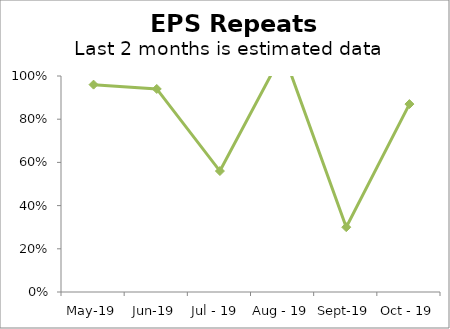
| Category | LONG FURLONG MEDICAL CENTRE |
|---|---|
| May-19 | 0.96 |
| Jun-19 | 0.94 |
| Jul - 19  | 0.56 |
| Aug - 19 | 1.11 |
| Sept-19 | 0.3 |
| Oct - 19 | 0.87 |